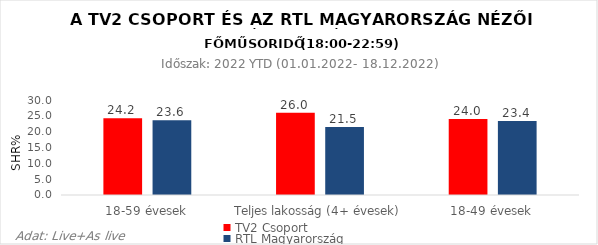
| Category | TV2 Csoport | RTL Magyarország |
|---|---|---|
| 18-59 évesek | 24.2 | 23.6 |
| Teljes lakosság (4+ évesek) | 26 | 21.5 |
| 18-49 évesek | 24 | 23.4 |